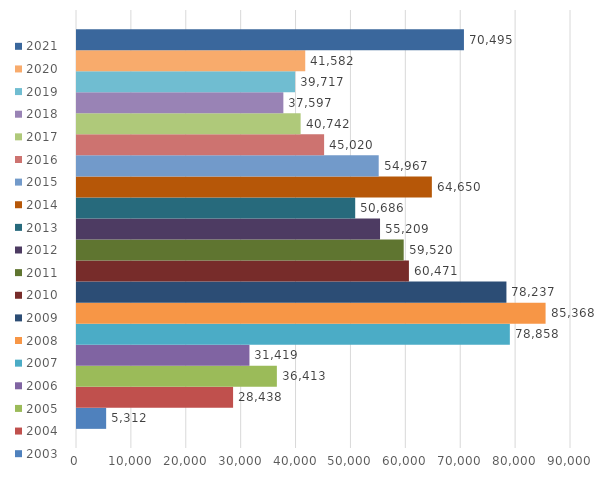
| Category | 2003 | 2004 | 2005 | 2006 | 2007 | 2008 | 2009 | 2010 | 2011 | 2012 | 2013 | 2014 | 2015 | 2016 | 2017 | 2018 | 2019 | 2020 | 2021 |
|---|---|---|---|---|---|---|---|---|---|---|---|---|---|---|---|---|---|---|---|
| 0 | 5312 | 28438 | 36413 | 31419 | 78858 | 85368 | 78237 | 60471 | 59520 | 55209 | 50686 | 64650 | 54967 | 45020 | 40742 | 37597 | 39717 | 41582 | 70495 |